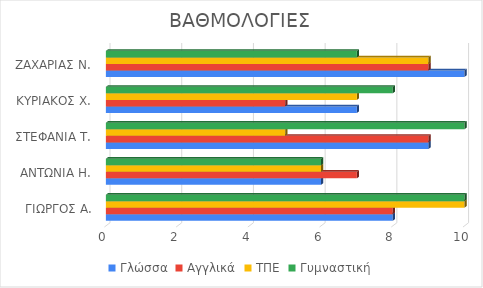
| Category | Γλώσσα | Αγγλικά | ΤΠΕ | Γυμναστική |
|---|---|---|---|---|
| ΓΙΩΡΓΟΣ Α. | 8 | 8 | 10 | 10 |
| ΑΝΤΩΝΙΑ Η. | 6 | 7 | 6 | 6 |
| ΣΤΕΦΑΝΙΑ Τ. | 9 | 9 | 5 | 10 |
| ΚΥΡΙΑΚΟΣ Χ. | 7 | 5 | 7 | 8 |
| ΖΑΧΑΡΙΑΣ Ν. | 10 | 9 | 9 | 7 |